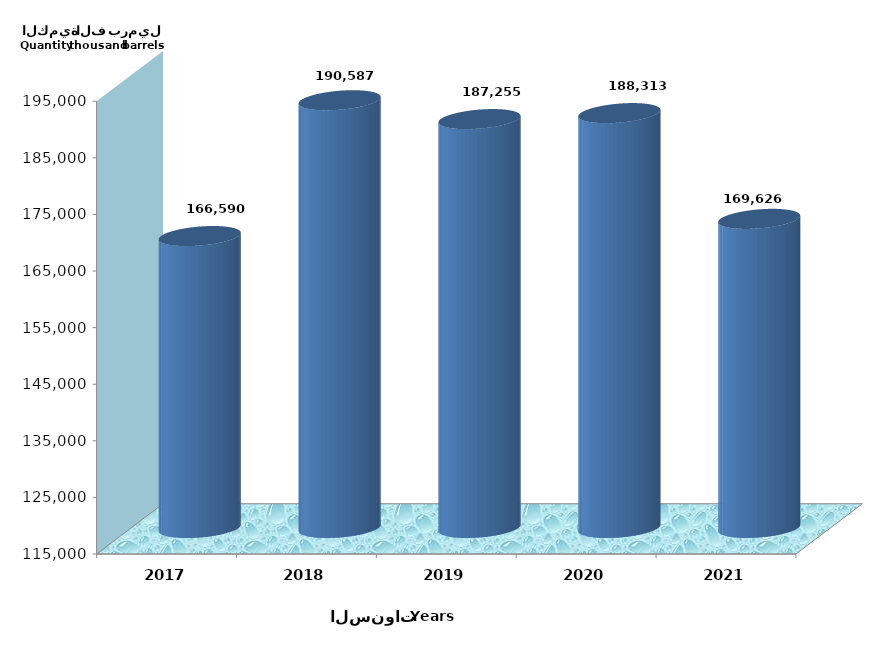
| Category | Series 0 |
|---|---|
| 2017 | 166590059.344 |
| 2018 | 190586727.136 |
| 2019 | 187255134.955 |
| 2020 | 188313351.994 |
| 2021 | 169625842 |